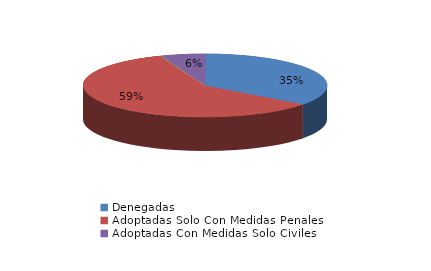
| Category | Series 0 |
|---|---|
| Denegadas | 12 |
| Adoptadas Solo Con Medidas Penales | 20 |
| Adoptadas Con Medidas Civiles Y Penales | 0 |
| Adoptadas Con Medidas Solo Civiles | 2 |